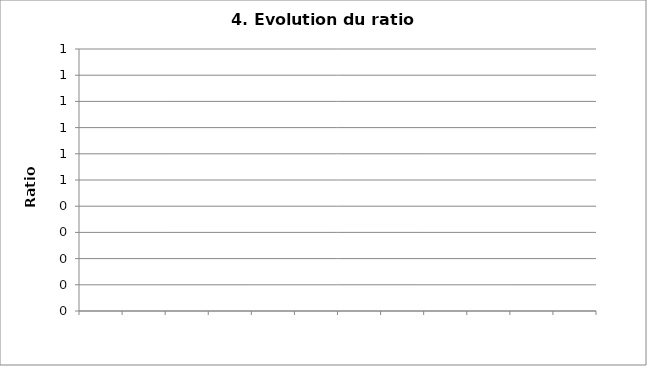
| Category | Consommation spécifique |
|---|---|
| 0 | 0 |
| 1 | 0 |
| 2 | 0 |
| 3 | 0 |
| 4 | 0 |
| 5 | 0 |
| 6 | 0 |
| 7 | 0 |
| 8 | 0 |
| 9 | 0 |
| 10 | 0 |
| 11 | 0 |